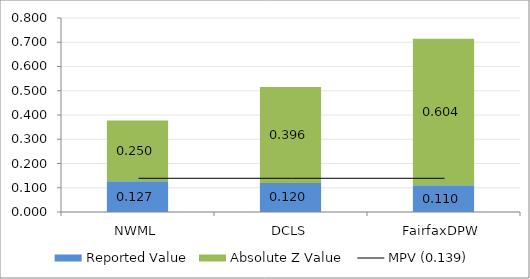
| Category | Reported Value | Absolute Z Value  |
|---|---|---|
| NWML | 0.127 | 0.25 |
| DCLS | 0.12 | 0.396 |
| FairfaxDPW | 0.11 | 0.604 |